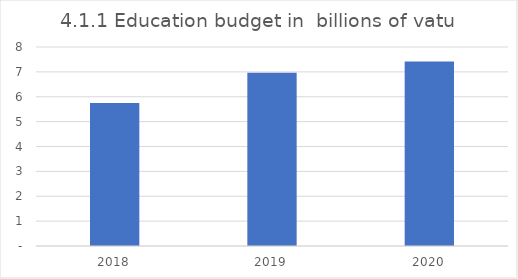
| Category | Education budget in  billions of vatu |
|---|---|
| 2018.0 | 5.75 |
| 2019.0 | 6.963 |
| 2020.0 | 7.417 |